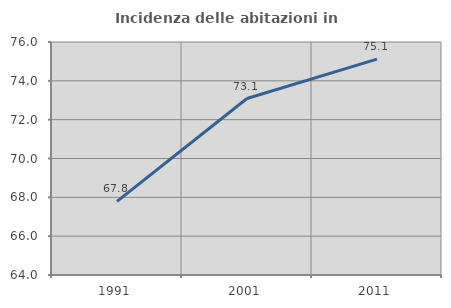
| Category | Incidenza delle abitazioni in proprietà  |
|---|---|
| 1991.0 | 67.79 |
| 2001.0 | 73.088 |
| 2011.0 | 75.116 |